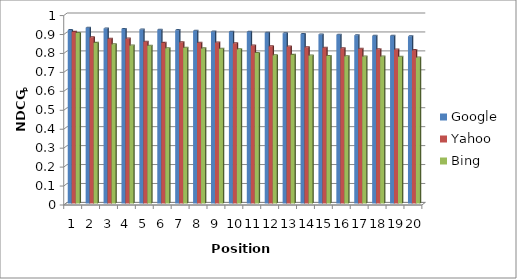
| Category | Google | Yahoo | Bing |
|---|---|---|---|
| 0 | 0.916 | 0.906 | 0.9 |
| 1 | 0.928 | 0.878 | 0.848 |
| 2 | 0.924 | 0.87 | 0.841 |
| 3 | 0.922 | 0.871 | 0.834 |
| 4 | 0.919 | 0.854 | 0.833 |
| 5 | 0.918 | 0.848 | 0.82 |
| 6 | 0.915 | 0.852 | 0.822 |
| 7 | 0.912 | 0.849 | 0.819 |
| 8 | 0.908 | 0.85 | 0.816 |
| 9 | 0.907 | 0.846 | 0.814 |
| 10 | 0.907 | 0.834 | 0.795 |
| 11 | 0.902 | 0.831 | 0.783 |
| 12 | 0.899 | 0.829 | 0.785 |
| 13 | 0.895 | 0.824 | 0.781 |
| 14 | 0.893 | 0.822 | 0.779 |
| 15 | 0.891 | 0.82 | 0.777 |
| 16 | 0.888 | 0.816 | 0.776 |
| 17 | 0.886 | 0.815 | 0.776 |
| 18 | 0.886 | 0.813 | 0.775 |
| 19 | 0.882 | 0.81 | 0.771 |